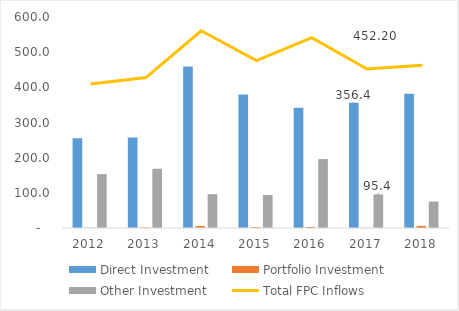
| Category | Direct Investment | Portfolio Investment | Other Investment |
|---|---|---|---|
| 2012.0 | 254.963 | 0.996 | 153.312 |
| 2013.0 | 257.642 | 1.66 | 168.416 |
| 2014.0 | 458.913 | 5.585 | 96.309 |
| 2015.0 | 379.845 | 2.542 | 93.865 |
| 2016.0 | 342.253 | 2.962 | 195.943 |
| 2017.0 | 356.437 | 0.342 | 95.417 |
| 2018.0 | 381.912 | 5.915 | 75.18 |